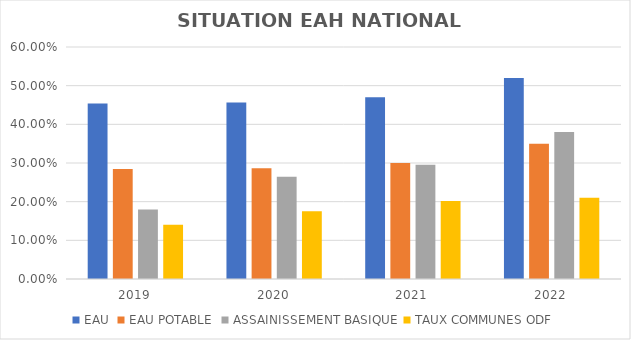
| Category | EAU | EAU POTABLE | ASSAINISSEMENT BASIQUE | TAUX COMMUNES ODF |
|---|---|---|---|---|
| 2019.0 | 0.454 | 0.284 | 0.179 | 0.14 |
| 2020.0 | 0.457 | 0.287 | 0.265 | 0.175 |
| 2021.0 | 0.47 | 0.3 | 0.295 | 0.202 |
| 2022.0 | 0.52 | 0.35 | 0.38 | 0.21 |